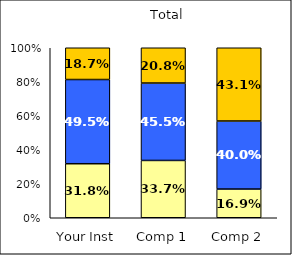
| Category | Low Institutional Priority: Increase Prestige | Average Institutional Priority: Increase Prestige | High Institutional Priority: Increase Prestige |
|---|---|---|---|
| Your Inst | 0.318 | 0.495 | 0.187 |
| Comp 1 | 0.337 | 0.455 | 0.208 |
| Comp 2 | 0.169 | 0.4 | 0.431 |